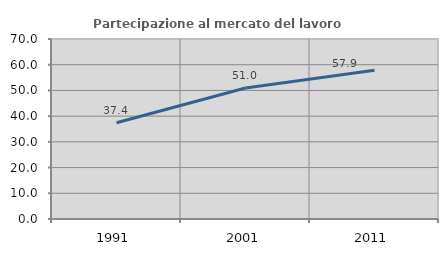
| Category | Partecipazione al mercato del lavoro  femminile |
|---|---|
| 1991.0 | 37.433 |
| 2001.0 | 50.951 |
| 2011.0 | 57.872 |